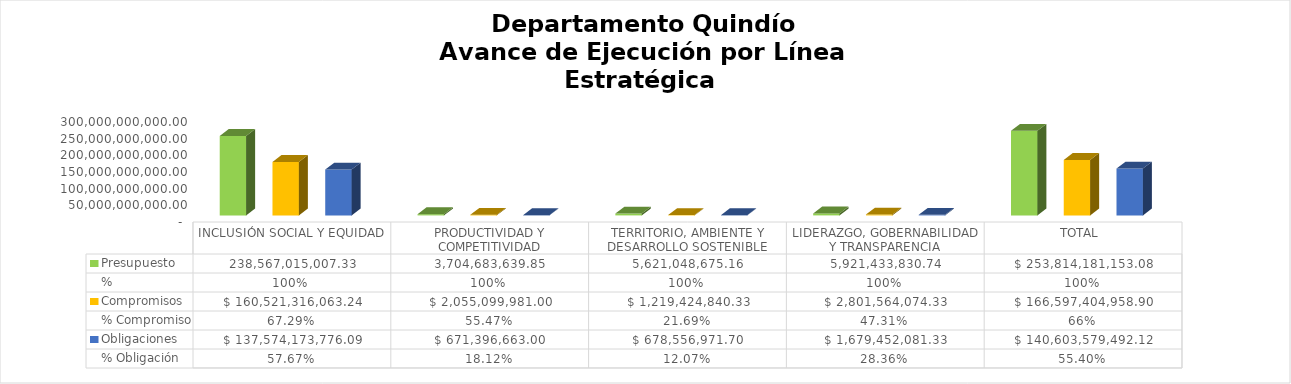
| Category | Presupuesto | %  | Compromisos | % Compromiso | Obligaciones | % Obligación |
|---|---|---|---|---|---|---|
| INCLUSIÓN SOCIAL Y EQUIDAD | 238567015007.33 | 1 | 160521316063.24 | 0.673 | 137574173776.09 | 0.577 |
| PRODUCTIVIDAD Y COMPETITIVIDAD | 3704683639.85 | 1 | 2055099981 | 0.555 | 671396663 | 0.181 |
| TERRITORIO, AMBIENTE Y DESARROLLO SOSTENIBLE | 5621048675.16 | 1 | 1219424840.33 | 0.217 | 678556971.7 | 0.121 |
| LIDERAZGO, GOBERNABILIDAD Y TRANSPARENCIA | 5921433830.74 | 1 | 2801564074.33 | 0.473 | 1679452081.33 | 0.284 |
| TOTAL  | 253814181153.08 | 1 | 166597404958.9 | 0.656 | 140603579492.12 | 0.554 |